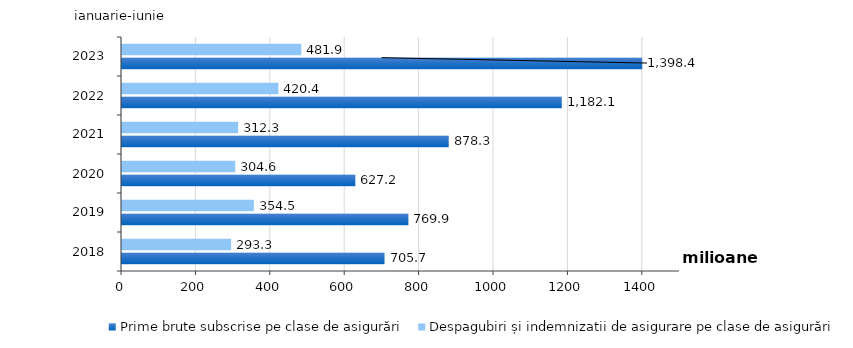
| Category | Prime brute subscrise pe clase de asigurări | Despagubiri și indemnizatii de asigurare pe clase de asigurări |
|---|---|---|
| 2018.0 | 705.712 | 293.332 |
| 2019.0 | 769.878 | 354.456 |
| 2020.0 | 627.248 | 304.555 |
| 2021.0 | 878.27 | 312.322 |
| 2022.0 | 1182.148 | 420.415 |
| 2023.0 | 1398.422 | 481.888 |